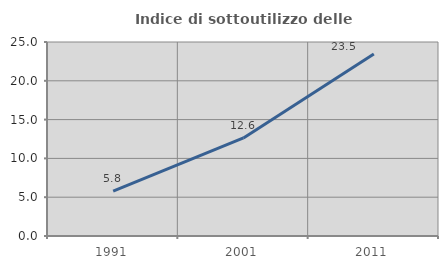
| Category | Indice di sottoutilizzo delle abitazioni  |
|---|---|
| 1991.0 | 5.769 |
| 2001.0 | 12.632 |
| 2011.0 | 23.457 |